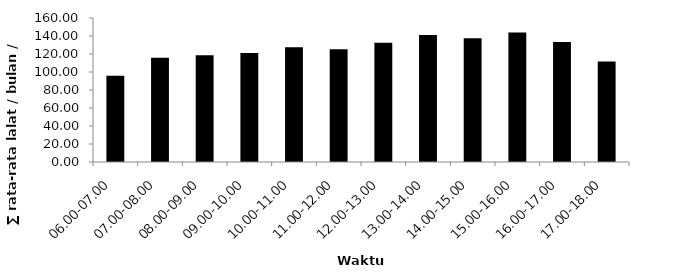
| Category | Series 0 |
|---|---|
| 06.00-07.00 | 95.911 |
| 07.00-08.00 | 115.867 |
| 08.00-09.00 | 118.556 |
| 09.00-10.00 | 121.089 |
| 10.00-11.00 | 127.444 |
| 11.00-12.00 | 125.244 |
| 12.00-13.00 | 132.378 |
| 13.00-14.00 | 140.978 |
| 14.00-15.00 | 137.511 |
| 15.00-16.00 | 144 |
| 16.00-17.00 | 133.422 |
| 17.00-18.00 | 111.6 |